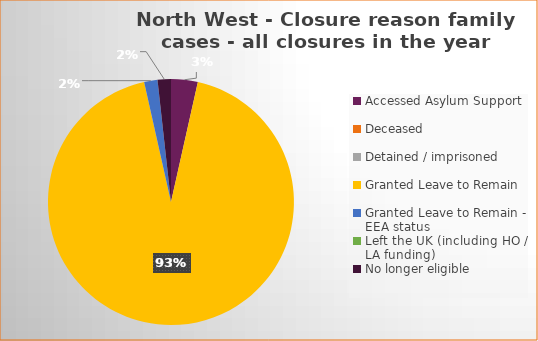
| Category | Total | Percentage |
|---|---|---|
| Accessed Asylum Support | 2 | 0.035 |
| Deceased | 0 | 0 |
| Detained / imprisoned | 0 | 0 |
| Granted Leave to Remain | 53 | 0.93 |
| Granted Leave to Remain - EEA status | 1 | 0.018 |
| Left the UK (including HO / LA funding)  | 0 | 0 |
| No longer eligible | 1 | 0.018 |